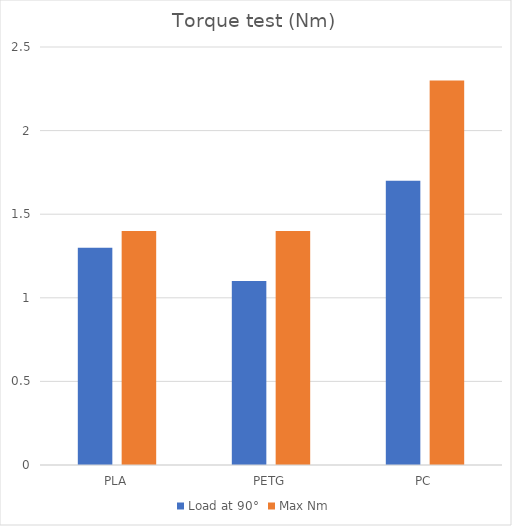
| Category | Load at 90° | Max Nm |
|---|---|---|
| PLA | 1.3 | 1.4 |
| PETG | 1.1 | 1.4 |
| PC | 1.7 | 2.3 |